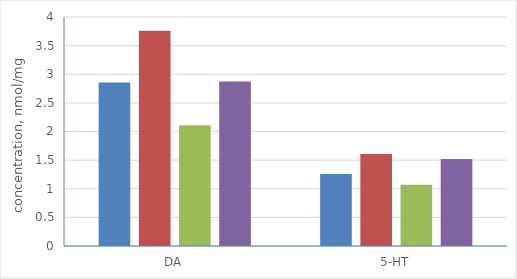
| Category | K | M | E | M+E |
|---|---|---|---|---|
| DA | 2.855 | 3.761 | 2.111 | 2.873 |
| 5-HT | 1.26 | 1.608 | 1.068 | 1.521 |